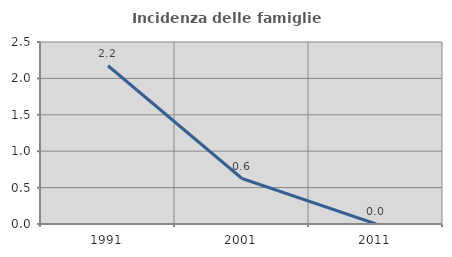
| Category | Incidenza delle famiglie numerose |
|---|---|
| 1991.0 | 2.174 |
| 2001.0 | 0.625 |
| 2011.0 | 0 |